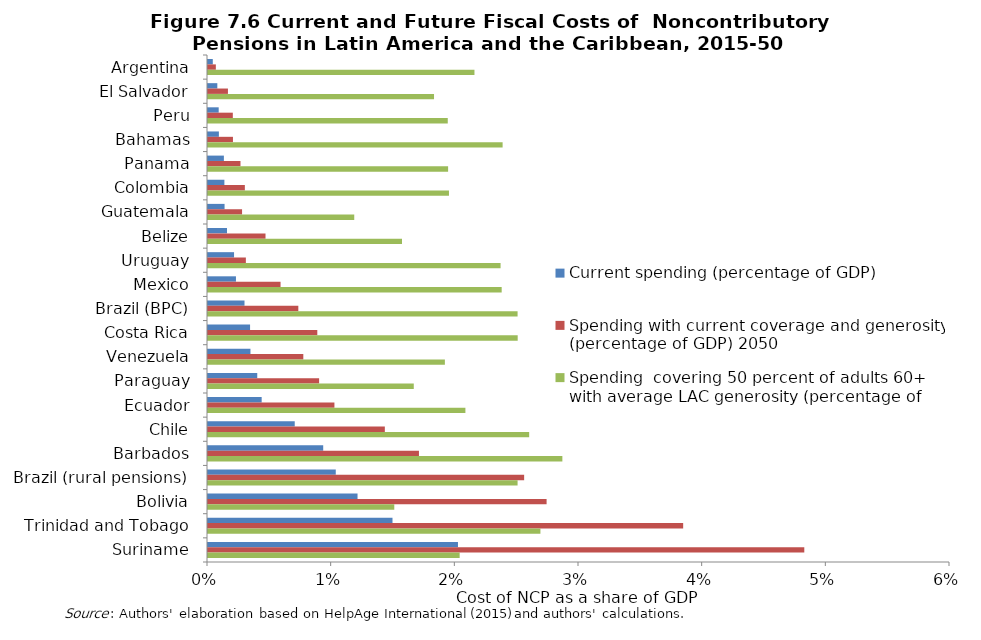
| Category | Current spending (percentage of GDP) | Spending with current coverage and generosity (percentage of GDP) 2050 | Spending  covering 50 percent of adults 60+ with average LAC generosity (percentage of GDP) 2050 |
|---|---|---|---|
| Argentina | 0 | 0.001 | 0.022 |
| El Salvador | 0.001 | 0.002 | 0.018 |
| Peru | 0.001 | 0.002 | 0.019 |
| Bahamas | 0.001 | 0.002 | 0.024 |
| Panama | 0.001 | 0.003 | 0.019 |
| Colombia | 0.001 | 0.003 | 0.019 |
| Guatemala | 0.001 | 0.003 | 0.012 |
| Belize | 0.002 | 0.005 | 0.016 |
| Uruguay | 0.002 | 0.003 | 0.024 |
| Mexico | 0.002 | 0.006 | 0.024 |
| Brazil (BPC) | 0.003 | 0.007 | 0.025 |
| Costa Rica | 0.003 | 0.009 | 0.025 |
| Venezuela | 0.003 | 0.008 | 0.019 |
| Paraguay | 0.004 | 0.009 | 0.017 |
| Ecuador | 0.004 | 0.01 | 0.021 |
| Chile | 0.007 | 0.014 | 0.026 |
| Barbados | 0.009 | 0.017 | 0.029 |
| Brazil (rural pensions) | 0.01 | 0.026 | 0.025 |
| Bolivia | 0.012 | 0.027 | 0.015 |
| Trinidad and Tobago | 0.015 | 0.038 | 0.027 |
| Suriname | 0.02 | 0.048 | 0.02 |